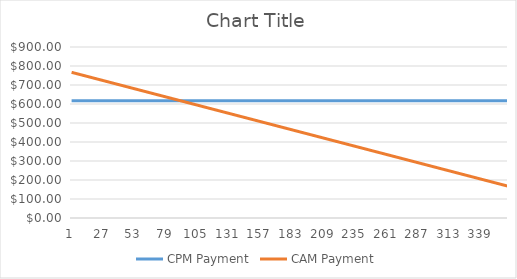
| Category | CPM Payment | CAM Payment |
|---|---|---|
| 0 | 617.168 | 766.667 |
| 1 | 617.168 | 765 |
| 2 | 617.168 | 763.333 |
| 3 | 617.168 | 761.667 |
| 4 | 617.168 | 760 |
| 5 | 617.168 | 758.333 |
| 6 | 617.168 | 756.667 |
| 7 | 617.168 | 755 |
| 8 | 617.168 | 753.333 |
| 9 | 617.168 | 751.667 |
| 10 | 617.168 | 750 |
| 11 | 617.168 | 748.333 |
| 12 | 617.168 | 746.667 |
| 13 | 617.168 | 745 |
| 14 | 617.168 | 743.333 |
| 15 | 617.168 | 741.667 |
| 16 | 617.168 | 740 |
| 17 | 617.168 | 738.333 |
| 18 | 617.168 | 736.667 |
| 19 | 617.168 | 735 |
| 20 | 617.168 | 733.333 |
| 21 | 617.168 | 731.667 |
| 22 | 617.168 | 730 |
| 23 | 617.168 | 728.333 |
| 24 | 617.168 | 726.667 |
| 25 | 617.168 | 725 |
| 26 | 617.168 | 723.333 |
| 27 | 617.168 | 721.667 |
| 28 | 617.168 | 720 |
| 29 | 617.168 | 718.333 |
| 30 | 617.168 | 716.667 |
| 31 | 617.168 | 715 |
| 32 | 617.168 | 713.333 |
| 33 | 617.168 | 711.667 |
| 34 | 617.168 | 710 |
| 35 | 617.168 | 708.333 |
| 36 | 617.168 | 706.667 |
| 37 | 617.168 | 705 |
| 38 | 617.168 | 703.333 |
| 39 | 617.168 | 701.667 |
| 40 | 617.168 | 700 |
| 41 | 617.168 | 698.333 |
| 42 | 617.168 | 696.667 |
| 43 | 617.168 | 695 |
| 44 | 617.168 | 693.333 |
| 45 | 617.168 | 691.667 |
| 46 | 617.168 | 690 |
| 47 | 617.168 | 688.333 |
| 48 | 617.168 | 686.667 |
| 49 | 617.168 | 685 |
| 50 | 617.168 | 683.333 |
| 51 | 617.168 | 681.667 |
| 52 | 617.168 | 680 |
| 53 | 617.168 | 678.333 |
| 54 | 617.168 | 676.667 |
| 55 | 617.168 | 675 |
| 56 | 617.168 | 673.333 |
| 57 | 617.168 | 671.667 |
| 58 | 617.168 | 670 |
| 59 | 617.168 | 668.333 |
| 60 | 617.168 | 666.667 |
| 61 | 617.168 | 665 |
| 62 | 617.168 | 663.333 |
| 63 | 617.168 | 661.667 |
| 64 | 617.168 | 660 |
| 65 | 617.168 | 658.333 |
| 66 | 617.168 | 656.667 |
| 67 | 617.168 | 655 |
| 68 | 617.168 | 653.333 |
| 69 | 617.168 | 651.667 |
| 70 | 617.168 | 650 |
| 71 | 617.168 | 648.333 |
| 72 | 617.168 | 646.667 |
| 73 | 617.168 | 645 |
| 74 | 617.168 | 643.333 |
| 75 | 617.168 | 641.667 |
| 76 | 617.168 | 640 |
| 77 | 617.168 | 638.333 |
| 78 | 617.168 | 636.667 |
| 79 | 617.168 | 635 |
| 80 | 617.168 | 633.333 |
| 81 | 617.168 | 631.667 |
| 82 | 617.168 | 630 |
| 83 | 617.168 | 628.333 |
| 84 | 617.168 | 626.667 |
| 85 | 617.168 | 625 |
| 86 | 617.168 | 623.333 |
| 87 | 617.168 | 621.667 |
| 88 | 617.168 | 620 |
| 89 | 617.168 | 618.333 |
| 90 | 617.168 | 616.667 |
| 91 | 617.168 | 615 |
| 92 | 617.168 | 613.333 |
| 93 | 617.168 | 611.667 |
| 94 | 617.168 | 610 |
| 95 | 617.168 | 608.333 |
| 96 | 617.168 | 606.667 |
| 97 | 617.168 | 605 |
| 98 | 617.168 | 603.333 |
| 99 | 617.168 | 601.667 |
| 100 | 617.168 | 600 |
| 101 | 617.168 | 598.333 |
| 102 | 617.168 | 596.667 |
| 103 | 617.168 | 595 |
| 104 | 617.168 | 593.333 |
| 105 | 617.168 | 591.667 |
| 106 | 617.168 | 590 |
| 107 | 617.168 | 588.333 |
| 108 | 617.168 | 586.667 |
| 109 | 617.168 | 585 |
| 110 | 617.168 | 583.333 |
| 111 | 617.168 | 581.667 |
| 112 | 617.168 | 580 |
| 113 | 617.168 | 578.333 |
| 114 | 617.168 | 576.667 |
| 115 | 617.168 | 575 |
| 116 | 617.168 | 573.333 |
| 117 | 617.168 | 571.667 |
| 118 | 617.168 | 570 |
| 119 | 617.168 | 568.333 |
| 120 | 617.168 | 566.667 |
| 121 | 617.168 | 565 |
| 122 | 617.168 | 563.333 |
| 123 | 617.168 | 561.667 |
| 124 | 617.168 | 560 |
| 125 | 617.168 | 558.333 |
| 126 | 617.168 | 556.667 |
| 127 | 617.168 | 555 |
| 128 | 617.168 | 553.333 |
| 129 | 617.168 | 551.667 |
| 130 | 617.168 | 550 |
| 131 | 617.168 | 548.333 |
| 132 | 617.168 | 546.667 |
| 133 | 617.168 | 545 |
| 134 | 617.168 | 543.333 |
| 135 | 617.168 | 541.667 |
| 136 | 617.168 | 540 |
| 137 | 617.168 | 538.333 |
| 138 | 617.168 | 536.667 |
| 139 | 617.168 | 535 |
| 140 | 617.168 | 533.333 |
| 141 | 617.168 | 531.667 |
| 142 | 617.168 | 530 |
| 143 | 617.168 | 528.333 |
| 144 | 617.168 | 526.667 |
| 145 | 617.168 | 525 |
| 146 | 617.168 | 523.333 |
| 147 | 617.168 | 521.667 |
| 148 | 617.168 | 520 |
| 149 | 617.168 | 518.333 |
| 150 | 617.168 | 516.667 |
| 151 | 617.168 | 515 |
| 152 | 617.168 | 513.333 |
| 153 | 617.168 | 511.667 |
| 154 | 617.168 | 510 |
| 155 | 617.168 | 508.333 |
| 156 | 617.168 | 506.667 |
| 157 | 617.168 | 505 |
| 158 | 617.168 | 503.333 |
| 159 | 617.168 | 501.667 |
| 160 | 617.168 | 500 |
| 161 | 617.168 | 498.333 |
| 162 | 617.168 | 496.667 |
| 163 | 617.168 | 495 |
| 164 | 617.168 | 493.333 |
| 165 | 617.168 | 491.667 |
| 166 | 617.168 | 490 |
| 167 | 617.168 | 488.333 |
| 168 | 617.168 | 486.667 |
| 169 | 617.168 | 485 |
| 170 | 617.168 | 483.333 |
| 171 | 617.168 | 481.667 |
| 172 | 617.168 | 480 |
| 173 | 617.168 | 478.333 |
| 174 | 617.168 | 476.667 |
| 175 | 617.168 | 475 |
| 176 | 617.168 | 473.333 |
| 177 | 617.168 | 471.667 |
| 178 | 617.168 | 470 |
| 179 | 617.168 | 468.333 |
| 180 | 617.168 | 466.667 |
| 181 | 617.168 | 465 |
| 182 | 617.168 | 463.333 |
| 183 | 617.168 | 461.667 |
| 184 | 617.168 | 460 |
| 185 | 617.168 | 458.333 |
| 186 | 617.168 | 456.667 |
| 187 | 617.168 | 455 |
| 188 | 617.168 | 453.333 |
| 189 | 617.168 | 451.667 |
| 190 | 617.168 | 450 |
| 191 | 617.168 | 448.333 |
| 192 | 617.168 | 446.667 |
| 193 | 617.168 | 445 |
| 194 | 617.168 | 443.333 |
| 195 | 617.168 | 441.667 |
| 196 | 617.168 | 440 |
| 197 | 617.168 | 438.333 |
| 198 | 617.168 | 436.667 |
| 199 | 617.168 | 435 |
| 200 | 617.168 | 433.333 |
| 201 | 617.168 | 431.667 |
| 202 | 617.168 | 430 |
| 203 | 617.168 | 428.333 |
| 204 | 617.168 | 426.667 |
| 205 | 617.168 | 425 |
| 206 | 617.168 | 423.333 |
| 207 | 617.168 | 421.667 |
| 208 | 617.168 | 420 |
| 209 | 617.168 | 418.333 |
| 210 | 617.168 | 416.667 |
| 211 | 617.168 | 415 |
| 212 | 617.168 | 413.333 |
| 213 | 617.168 | 411.667 |
| 214 | 617.168 | 410 |
| 215 | 617.168 | 408.333 |
| 216 | 617.168 | 406.667 |
| 217 | 617.168 | 405 |
| 218 | 617.168 | 403.333 |
| 219 | 617.168 | 401.667 |
| 220 | 617.168 | 400 |
| 221 | 617.168 | 398.333 |
| 222 | 617.168 | 396.667 |
| 223 | 617.168 | 395 |
| 224 | 617.168 | 393.333 |
| 225 | 617.168 | 391.667 |
| 226 | 617.168 | 390 |
| 227 | 617.168 | 388.333 |
| 228 | 617.168 | 386.667 |
| 229 | 617.168 | 385 |
| 230 | 617.168 | 383.333 |
| 231 | 617.168 | 381.667 |
| 232 | 617.168 | 380 |
| 233 | 617.168 | 378.333 |
| 234 | 617.168 | 376.667 |
| 235 | 617.168 | 375 |
| 236 | 617.168 | 373.333 |
| 237 | 617.168 | 371.667 |
| 238 | 617.168 | 370 |
| 239 | 617.168 | 368.333 |
| 240 | 617.168 | 366.667 |
| 241 | 617.168 | 365 |
| 242 | 617.168 | 363.333 |
| 243 | 617.168 | 361.667 |
| 244 | 617.168 | 360 |
| 245 | 617.168 | 358.333 |
| 246 | 617.168 | 356.667 |
| 247 | 617.168 | 355 |
| 248 | 617.168 | 353.333 |
| 249 | 617.168 | 351.667 |
| 250 | 617.168 | 350 |
| 251 | 617.168 | 348.333 |
| 252 | 617.168 | 346.667 |
| 253 | 617.168 | 345 |
| 254 | 617.168 | 343.333 |
| 255 | 617.168 | 341.667 |
| 256 | 617.168 | 340 |
| 257 | 617.168 | 338.333 |
| 258 | 617.168 | 336.667 |
| 259 | 617.168 | 335 |
| 260 | 617.168 | 333.333 |
| 261 | 617.168 | 331.667 |
| 262 | 617.168 | 330 |
| 263 | 617.168 | 328.333 |
| 264 | 617.168 | 326.667 |
| 265 | 617.168 | 325 |
| 266 | 617.168 | 323.333 |
| 267 | 617.168 | 321.667 |
| 268 | 617.168 | 320 |
| 269 | 617.168 | 318.333 |
| 270 | 617.168 | 316.667 |
| 271 | 617.168 | 315 |
| 272 | 617.168 | 313.333 |
| 273 | 617.168 | 311.667 |
| 274 | 617.168 | 310 |
| 275 | 617.168 | 308.333 |
| 276 | 617.168 | 306.667 |
| 277 | 617.168 | 305 |
| 278 | 617.168 | 303.333 |
| 279 | 617.168 | 301.667 |
| 280 | 617.168 | 300 |
| 281 | 617.168 | 298.333 |
| 282 | 617.168 | 296.667 |
| 283 | 617.168 | 295 |
| 284 | 617.168 | 293.333 |
| 285 | 617.168 | 291.667 |
| 286 | 617.168 | 290 |
| 287 | 617.168 | 288.333 |
| 288 | 617.168 | 286.667 |
| 289 | 617.168 | 285 |
| 290 | 617.168 | 283.333 |
| 291 | 617.168 | 281.667 |
| 292 | 617.168 | 280 |
| 293 | 617.168 | 278.333 |
| 294 | 617.168 | 276.667 |
| 295 | 617.168 | 275 |
| 296 | 617.168 | 273.333 |
| 297 | 617.168 | 271.667 |
| 298 | 617.168 | 270 |
| 299 | 617.168 | 268.333 |
| 300 | 617.168 | 266.667 |
| 301 | 617.168 | 265 |
| 302 | 617.168 | 263.333 |
| 303 | 617.168 | 261.667 |
| 304 | 617.168 | 260 |
| 305 | 617.168 | 258.333 |
| 306 | 617.168 | 256.667 |
| 307 | 617.168 | 255 |
| 308 | 617.168 | 253.333 |
| 309 | 617.168 | 251.667 |
| 310 | 617.168 | 250 |
| 311 | 617.168 | 248.333 |
| 312 | 617.168 | 246.667 |
| 313 | 617.168 | 245 |
| 314 | 617.168 | 243.333 |
| 315 | 617.168 | 241.667 |
| 316 | 617.168 | 240 |
| 317 | 617.168 | 238.333 |
| 318 | 617.168 | 236.667 |
| 319 | 617.168 | 235 |
| 320 | 617.168 | 233.333 |
| 321 | 617.168 | 231.667 |
| 322 | 617.168 | 230 |
| 323 | 617.168 | 228.333 |
| 324 | 617.168 | 226.667 |
| 325 | 617.168 | 225 |
| 326 | 617.168 | 223.333 |
| 327 | 617.168 | 221.667 |
| 328 | 617.168 | 220 |
| 329 | 617.168 | 218.333 |
| 330 | 617.168 | 216.667 |
| 331 | 617.168 | 215 |
| 332 | 617.168 | 213.333 |
| 333 | 617.168 | 211.667 |
| 334 | 617.168 | 210 |
| 335 | 617.168 | 208.333 |
| 336 | 617.168 | 206.667 |
| 337 | 617.168 | 205 |
| 338 | 617.168 | 203.333 |
| 339 | 617.168 | 201.667 |
| 340 | 617.168 | 200 |
| 341 | 617.168 | 198.333 |
| 342 | 617.168 | 196.667 |
| 343 | 617.168 | 195 |
| 344 | 617.168 | 193.333 |
| 345 | 617.168 | 191.667 |
| 346 | 617.168 | 190 |
| 347 | 617.168 | 188.333 |
| 348 | 617.168 | 186.667 |
| 349 | 617.168 | 185 |
| 350 | 617.168 | 183.333 |
| 351 | 617.168 | 181.667 |
| 352 | 617.168 | 180 |
| 353 | 617.168 | 178.333 |
| 354 | 617.168 | 176.667 |
| 355 | 617.168 | 175 |
| 356 | 617.168 | 173.333 |
| 357 | 617.168 | 171.667 |
| 358 | 617.168 | 170 |
| 359 | 617.168 | 168.333 |